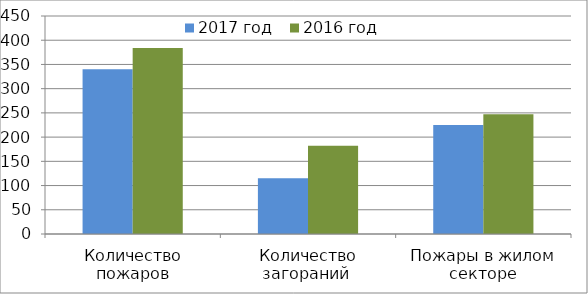
| Category | 2017 год | 2016 год |
|---|---|---|
| Количество пожаров | 340 | 384 |
| Количество загораний  | 115 | 182 |
| Пожары в жилом секторе | 225 | 247 |